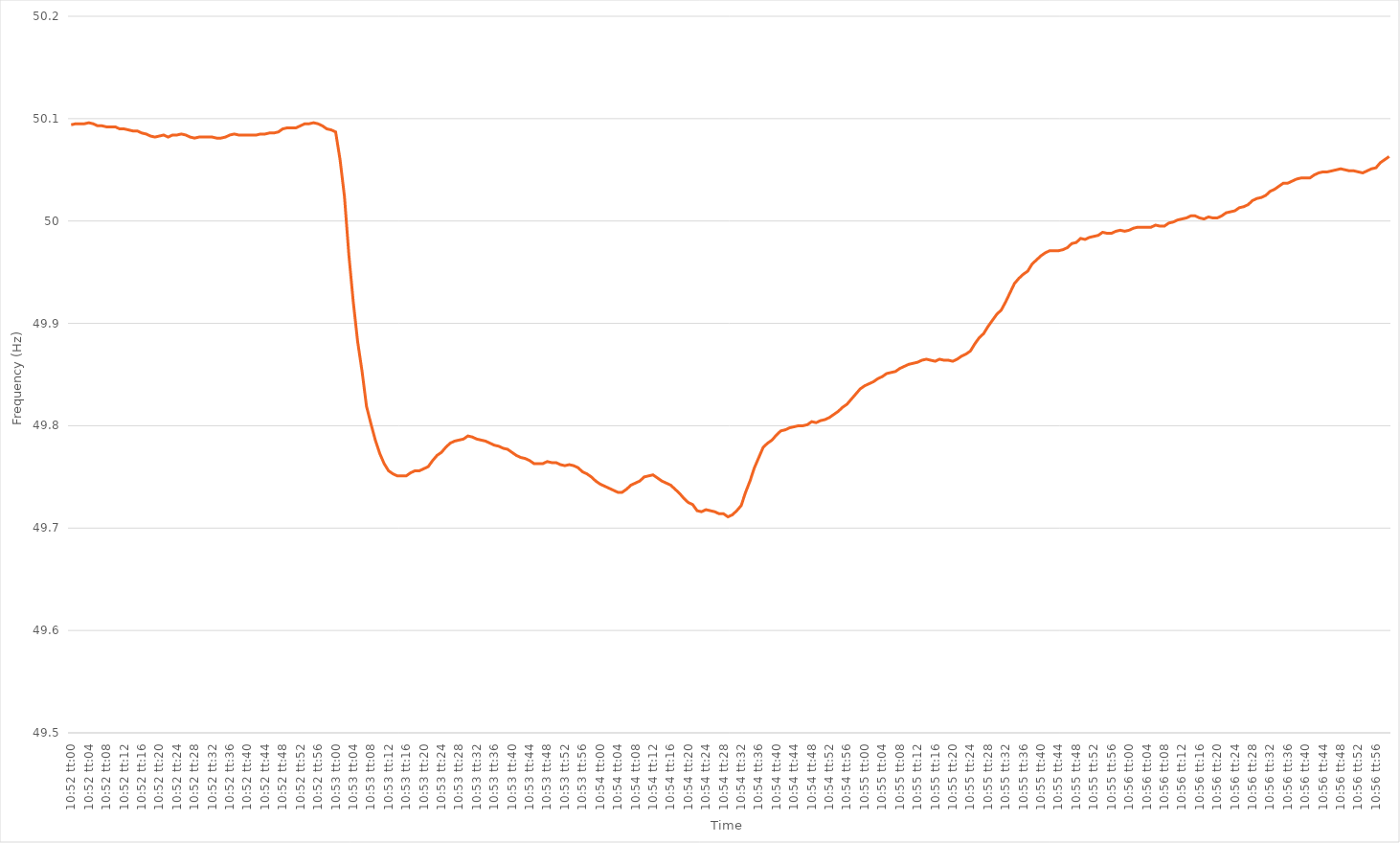
| Category | Series 0 |
|---|---|
| 0.4527777777777778 | 50.094 |
| 0.4527893518518518 | 50.095 |
| 0.45280092592592597 | 50.095 |
| 0.4528125 | 50.095 |
| 0.4528240740740741 | 50.096 |
| 0.45283564814814814 | 50.095 |
| 0.45284722222222223 | 50.093 |
| 0.4528587962962963 | 50.093 |
| 0.4528703703703704 | 50.092 |
| 0.45288194444444446 | 50.092 |
| 0.4528935185185185 | 50.092 |
| 0.4529050925925926 | 50.09 |
| 0.45291666666666663 | 50.09 |
| 0.45292824074074073 | 50.089 |
| 0.45293981481481477 | 50.088 |
| 0.4529513888888889 | 50.088 |
| 0.45296296296296296 | 50.086 |
| 0.45297453703703705 | 50.085 |
| 0.4529861111111111 | 50.083 |
| 0.4529976851851852 | 50.082 |
| 0.4530092592592592 | 50.083 |
| 0.4530208333333334 | 50.084 |
| 0.4530324074074074 | 50.082 |
| 0.4530439814814815 | 50.084 |
| 0.45305555555555554 | 50.084 |
| 0.45306712962962964 | 50.085 |
| 0.4530787037037037 | 50.084 |
| 0.45309027777777783 | 50.082 |
| 0.45310185185185187 | 50.081 |
| 0.45311342592592596 | 50.082 |
| 0.453125 | 50.082 |
| 0.45313657407407404 | 50.082 |
| 0.45314814814814813 | 50.082 |
| 0.45315972222222217 | 50.081 |
| 0.4531712962962963 | 50.081 |
| 0.45318287037037036 | 50.082 |
| 0.45319444444444446 | 50.084 |
| 0.4532060185185185 | 50.085 |
| 0.4532175925925926 | 50.084 |
| 0.4532291666666666 | 50.084 |
| 0.4532407407407408 | 50.084 |
| 0.4532523148148148 | 50.084 |
| 0.4532638888888889 | 50.084 |
| 0.45327546296296295 | 50.085 |
| 0.45328703703703704 | 50.085 |
| 0.4532986111111111 | 50.086 |
| 0.45331018518518523 | 50.086 |
| 0.45332175925925927 | 50.087 |
| 0.45333333333333337 | 50.09 |
| 0.4533449074074074 | 50.091 |
| 0.4533564814814815 | 50.091 |
| 0.45336805555555554 | 50.091 |
| 0.4533796296296296 | 50.093 |
| 0.4533912037037037 | 50.095 |
| 0.45340277777777777 | 50.095 |
| 0.45341435185185186 | 50.096 |
| 0.4534259259259259 | 50.095 |
| 0.4534375 | 50.093 |
| 0.45344907407407403 | 50.09 |
| 0.4534606481481482 | 50.089 |
| 0.4534722222222222 | 50.087 |
| 0.4534837962962963 | 50.06 |
| 0.45349537037037035 | 50.024 |
| 0.45350694444444445 | 49.967 |
| 0.4535185185185185 | 49.921 |
| 0.45353009259259264 | 49.882 |
| 0.4535416666666667 | 49.853 |
| 0.45355324074074077 | 49.819 |
| 0.4535648148148148 | 49.802 |
| 0.4535763888888889 | 49.786 |
| 0.45358796296296294 | 49.773 |
| 0.453599537037037 | 49.763 |
| 0.45361111111111113 | 49.756 |
| 0.45362268518518517 | 49.753 |
| 0.45363425925925926 | 49.751 |
| 0.4536458333333333 | 49.751 |
| 0.4536574074074074 | 49.751 |
| 0.45366898148148144 | 49.754 |
| 0.4536805555555556 | 49.756 |
| 0.4536921296296296 | 49.756 |
| 0.4537037037037037 | 49.758 |
| 0.45371527777777776 | 49.76 |
| 0.45372685185185185 | 49.766 |
| 0.4537384259259259 | 49.771 |
| 0.45375000000000004 | 49.774 |
| 0.4537615740740741 | 49.779 |
| 0.4537731481481482 | 49.783 |
| 0.4537847222222222 | 49.785 |
| 0.4537962962962963 | 49.786 |
| 0.45380787037037035 | 49.787 |
| 0.4538194444444445 | 49.79 |
| 0.45383101851851854 | 49.789 |
| 0.4538425925925926 | 49.787 |
| 0.45385416666666667 | 49.786 |
| 0.4538657407407407 | 49.785 |
| 0.4538773148148148 | 49.783 |
| 0.45388888888888884 | 49.781 |
| 0.453900462962963 | 49.78 |
| 0.45391203703703703 | 49.778 |
| 0.4539236111111111 | 49.777 |
| 0.45393518518518516 | 49.774 |
| 0.45394675925925926 | 49.771 |
| 0.4539583333333333 | 49.769 |
| 0.45396990740740745 | 49.768 |
| 0.4539814814814815 | 49.766 |
| 0.4539930555555556 | 49.763 |
| 0.4540046296296296 | 49.763 |
| 0.4540162037037037 | 49.763 |
| 0.45402777777777775 | 49.765 |
| 0.4540393518518519 | 49.764 |
| 0.45405092592592594 | 49.764 |
| 0.45406250000000004 | 49.762 |
| 0.4540740740740741 | 49.761 |
| 0.4540856481481481 | 49.762 |
| 0.4540972222222222 | 49.761 |
| 0.45410879629629625 | 49.759 |
| 0.4541203703703704 | 49.755 |
| 0.45413194444444444 | 49.753 |
| 0.45414351851851853 | 49.75 |
| 0.45415509259259257 | 49.746 |
| 0.45416666666666666 | 49.743 |
| 0.4541782407407407 | 49.741 |
| 0.45418981481481485 | 49.739 |
| 0.4542013888888889 | 49.737 |
| 0.454212962962963 | 49.735 |
| 0.454224537037037 | 49.735 |
| 0.4542361111111111 | 49.738 |
| 0.45424768518518516 | 49.742 |
| 0.4542592592592593 | 49.744 |
| 0.45427083333333335 | 49.746 |
| 0.45428240740740744 | 49.75 |
| 0.4542939814814815 | 49.751 |
| 0.4543055555555556 | 49.752 |
| 0.4543171296296296 | 49.749 |
| 0.45432870370370365 | 49.746 |
| 0.4543402777777778 | 49.744 |
| 0.45435185185185184 | 49.742 |
| 0.45436342592592593 | 49.738 |
| 0.454375 | 49.734 |
| 0.45438657407407407 | 49.729 |
| 0.4543981481481481 | 49.725 |
| 0.45440972222222226 | 49.723 |
| 0.4544212962962963 | 49.717 |
| 0.4544328703703704 | 49.716 |
| 0.45444444444444443 | 49.718 |
| 0.4544560185185185 | 49.717 |
| 0.45446759259259256 | 49.716 |
| 0.4544791666666667 | 49.714 |
| 0.45449074074074075 | 49.714 |
| 0.45450231481481485 | 49.711 |
| 0.4545138888888889 | 49.713 |
| 0.454525462962963 | 49.717 |
| 0.454537037037037 | 49.722 |
| 0.45454861111111106 | 49.735 |
| 0.4545601851851852 | 49.746 |
| 0.45457175925925924 | 49.759 |
| 0.45458333333333334 | 49.769 |
| 0.4545949074074074 | 49.779 |
| 0.4546064814814815 | 49.783 |
| 0.4546180555555555 | 49.786 |
| 0.45462962962962966 | 49.791 |
| 0.4546412037037037 | 49.795 |
| 0.4546527777777778 | 49.796 |
| 0.45466435185185183 | 49.798 |
| 0.45467592592592593 | 49.799 |
| 0.45468749999999997 | 49.8 |
| 0.4546990740740741 | 49.8 |
| 0.45471064814814816 | 49.801 |
| 0.45472222222222225 | 49.804 |
| 0.4547337962962963 | 49.803 |
| 0.4547453703703704 | 49.805 |
| 0.4547569444444444 | 49.806 |
| 0.45476851851851857 | 49.808 |
| 0.4547800925925926 | 49.811 |
| 0.45479166666666665 | 49.814 |
| 0.45480324074074074 | 49.818 |
| 0.4548148148148148 | 49.821 |
| 0.4548263888888889 | 49.826 |
| 0.4548379629629629 | 49.831 |
| 0.45484953703703707 | 49.836 |
| 0.4548611111111111 | 49.839 |
| 0.4548726851851852 | 49.841 |
| 0.45488425925925924 | 49.843 |
| 0.45489583333333333 | 49.846 |
| 0.45490740740740737 | 49.848 |
| 0.4549189814814815 | 49.851 |
| 0.45493055555555556 | 49.852 |
| 0.45494212962962965 | 49.853 |
| 0.4549537037037037 | 49.856 |
| 0.4549652777777778 | 49.858 |
| 0.4549768518518518 | 49.86 |
| 0.454988425925926 | 49.861 |
| 0.455 | 49.862 |
| 0.4550115740740741 | 49.864 |
| 0.45502314814814815 | 49.865 |
| 0.4550347222222222 | 49.864 |
| 0.4550462962962963 | 49.863 |
| 0.4550578703703703 | 49.865 |
| 0.45506944444444447 | 49.864 |
| 0.4550810185185185 | 49.864 |
| 0.4550925925925926 | 49.863 |
| 0.45510416666666664 | 49.865 |
| 0.45511574074074074 | 49.868 |
| 0.4551273148148148 | 49.87 |
| 0.4551388888888889 | 49.873 |
| 0.45515046296296297 | 49.88 |
| 0.45516203703703706 | 49.886 |
| 0.4551736111111111 | 49.89 |
| 0.4551851851851852 | 49.897 |
| 0.45519675925925923 | 49.903 |
| 0.4552083333333334 | 49.909 |
| 0.4552199074074074 | 49.913 |
| 0.4552314814814815 | 49.921 |
| 0.45524305555555555 | 49.93 |
| 0.45525462962962965 | 49.939 |
| 0.4552662037037037 | 49.944 |
| 0.4552777777777777 | 49.948 |
| 0.4552893518518519 | 49.951 |
| 0.4553009259259259 | 49.958 |
| 0.4553125 | 49.962 |
| 0.45532407407407405 | 49.966 |
| 0.45533564814814814 | 49.969 |
| 0.4553472222222222 | 49.971 |
| 0.45535879629629633 | 49.971 |
| 0.45537037037037037 | 49.971 |
| 0.45538194444444446 | 49.972 |
| 0.4553935185185185 | 49.974 |
| 0.4554050925925926 | 49.978 |
| 0.45541666666666664 | 49.979 |
| 0.4554282407407408 | 49.983 |
| 0.4554398148148148 | 49.982 |
| 0.4554513888888889 | 49.984 |
| 0.45546296296296296 | 49.985 |
| 0.45547453703703705 | 49.986 |
| 0.4554861111111111 | 49.989 |
| 0.45549768518518513 | 49.988 |
| 0.4555092592592593 | 49.988 |
| 0.4555208333333333 | 49.99 |
| 0.4555324074074074 | 49.991 |
| 0.45554398148148145 | 49.99 |
| 0.45555555555555555 | 49.991 |
| 0.4555671296296296 | 49.993 |
| 0.45557870370370374 | 49.994 |
| 0.4555902777777778 | 49.994 |
| 0.45560185185185187 | 49.994 |
| 0.4556134259259259 | 49.994 |
| 0.455625 | 49.996 |
| 0.45563657407407404 | 49.995 |
| 0.4556481481481482 | 49.995 |
| 0.45565972222222223 | 49.998 |
| 0.4556712962962963 | 49.999 |
| 0.45568287037037036 | 50.001 |
| 0.45569444444444446 | 50.002 |
| 0.4557060185185185 | 50.003 |
| 0.45571759259259265 | 50.005 |
| 0.4557291666666667 | 50.005 |
| 0.4557407407407407 | 50.003 |
| 0.4557523148148148 | 50.002 |
| 0.45576388888888886 | 50.004 |
| 0.45577546296296295 | 50.003 |
| 0.455787037037037 | 50.003 |
| 0.45579861111111114 | 50.005 |
| 0.4558101851851852 | 50.008 |
| 0.4558217592592593 | 50.009 |
| 0.4558333333333333 | 50.01 |
| 0.4558449074074074 | 50.013 |
| 0.45585648148148145 | 50.014 |
| 0.4558680555555556 | 50.016 |
| 0.45587962962962963 | 50.02 |
| 0.45589120370370373 | 50.022 |
| 0.45590277777777777 | 50.023 |
| 0.45591435185185186 | 50.025 |
| 0.4559259259259259 | 50.029 |
| 0.45593750000000005 | 50.031 |
| 0.4559490740740741 | 50.034 |
| 0.4559606481481482 | 50.037 |
| 0.4559722222222222 | 50.037 |
| 0.45598379629629626 | 50.039 |
| 0.45599537037037036 | 50.041 |
| 0.4560069444444444 | 50.042 |
| 0.45601851851851855 | 50.042 |
| 0.4560300925925926 | 50.042 |
| 0.4560416666666667 | 50.045 |
| 0.4560532407407407 | 50.047 |
| 0.4560648148148148 | 50.048 |
| 0.45607638888888885 | 50.048 |
| 0.456087962962963 | 50.049 |
| 0.45609953703703704 | 50.05 |
| 0.45611111111111113 | 50.051 |
| 0.4561226851851852 | 50.05 |
| 0.45613425925925927 | 50.049 |
| 0.4561458333333333 | 50.049 |
| 0.45615740740740746 | 50.048 |
| 0.4561689814814815 | 50.047 |
| 0.4561805555555556 | 50.049 |
| 0.45619212962962963 | 50.051 |
| 0.45620370370370367 | 50.052 |
| 0.45621527777777776 | 50.057 |
| 0.4562268518518518 | 50.06 |
| 0.45623842592592595 | 50.063 |